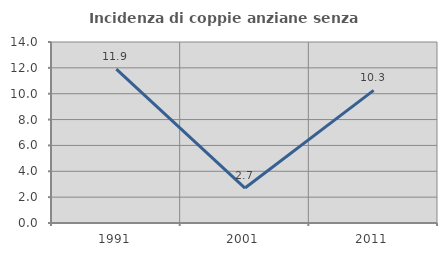
| Category | Incidenza di coppie anziane senza figli  |
|---|---|
| 1991.0 | 11.905 |
| 2001.0 | 2.703 |
| 2011.0 | 10.256 |